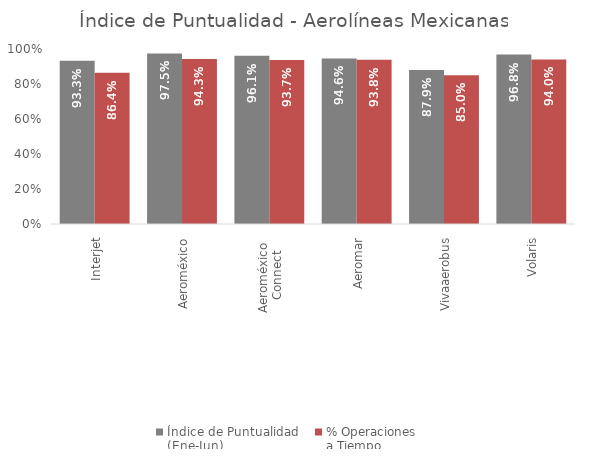
| Category | Índice de Puntualidad
(Ene-Jun) | % Operaciones 
a Tiempo |
|---|---|---|
| Interjet | 0.933 | 0.864 |
| Aeroméxico | 0.975 | 0.943 |
| Aeroméxico 
Connect | 0.961 | 0.937 |
| Aeromar | 0.946 | 0.938 |
| Vivaaerobus | 0.879 | 0.85 |
| Volaris | 0.968 | 0.94 |